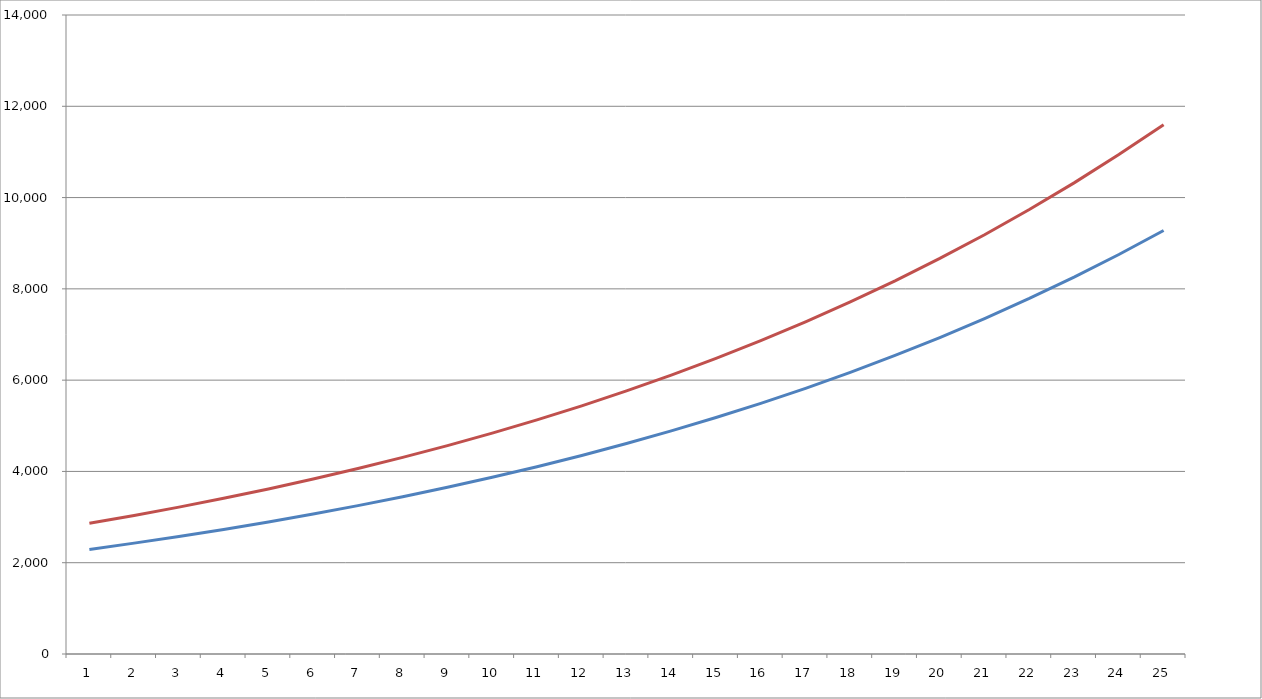
| Category | Series 0 | Series 1 |
|---|---|---|
| 0 | 2291.52 | 2864.4 |
| 1 | 2429.011 | 3036.264 |
| 2 | 2574.752 | 3218.44 |
| 3 | 2729.237 | 3411.546 |
| 4 | 2892.991 | 3616.239 |
| 5 | 3066.571 | 3833.213 |
| 6 | 3250.565 | 4063.206 |
| 7 | 3445.599 | 4306.999 |
| 8 | 3652.335 | 4565.418 |
| 9 | 3871.475 | 4839.344 |
| 10 | 4103.763 | 5129.704 |
| 11 | 4349.989 | 5437.486 |
| 12 | 4610.988 | 5763.736 |
| 13 | 4887.648 | 6109.56 |
| 14 | 5180.907 | 6476.133 |
| 15 | 5491.761 | 6864.701 |
| 16 | 5821.267 | 7276.583 |
| 17 | 6170.543 | 7713.178 |
| 18 | 6540.775 | 8175.969 |
| 19 | 6933.222 | 8666.527 |
| 20 | 7349.215 | 9186.519 |
| 21 | 7790.168 | 9737.71 |
| 22 | 8257.578 | 10321.973 |
| 23 | 8753.033 | 10941.291 |
| 24 | 9278.215 | 11597.768 |